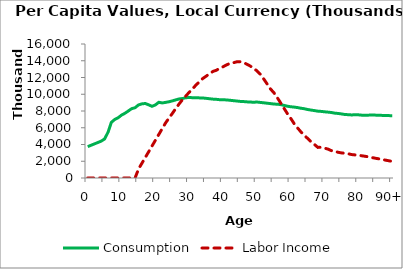
| Category | Consumption | Labor Income |
|---|---|---|
| 0 | 3745251.584 | 0 |
|  | 3909814.587 | 0 |
| 2 | 4074377.591 | 0 |
| 3 | 4237918.199 | 0 |
| 4 | 4400524.77 | 0 |
| 5 | 4662860.164 | 0 |
| 6 | 5458535.545 | 0 |
| 7 | 6646871.06 | 0 |
| 8 | 6991298.712 | 0 |
| 9 | 7197178.647 | 0 |
| 10 | 7509465.472 | 0 |
| 11 | 7729986.649 | 0 |
| 12 | 8002725.551 | 0 |
| 13 | 8279361.303 | 0 |
| 14 | 8392233.333 | 0 |
| 15 | 8719309.355 | 1059269.463 |
| 16 | 8852057.578 | 1747743.756 |
| 17 | 8897467.55 | 2436218.049 |
| 18 | 8738287.109 | 3124692.342 |
| 19 | 8560415.335 | 3813166.635 |
| 20 | 8723828.224 | 4501640.928 |
| 21 | 9040457.481 | 5190115.222 |
| 22 | 8963164.092 | 5878589.515 |
| 23 | 9029614.118 | 6567063.808 |
| 24 | 9102007.376 | 7153046.101 |
| 25 | 9207066.501 | 7705325.697 |
| 26 | 9325582.469 | 8280060.173 |
| 27 | 9438328.106 | 8840165.574 |
| 28 | 9489061.127 | 9352847.706 |
| 29 | 9588001.711 | 9796158.954 |
| 30 | 9609347.91 | 10235445.239 |
| 31 | 9591342.672 | 10656052.38 |
| 32 | 9595859.433 | 11102591.797 |
| 33 | 9565361.682 | 11480772.317 |
| 34 | 9553345.202 | 11879019.632 |
| 35 | 9512099.17 | 12157354.94 |
| 36 | 9463195.088 | 12453028.009 |
| 37 | 9418272.195 | 12724075.075 |
| 38 | 9393831.541 | 12860086.536 |
| 39 | 9349389.999 | 13099039.984 |
| 40 | 9343941.247 | 13283092.986 |
| 41 | 9322019.957 | 13503648.425 |
| 42 | 9283372.198 | 13672732.448 |
| 43 | 9236088.722 | 13751619.382 |
| 44 | 9194712.494 | 13869791.723 |
| 45 | 9148820.807 | 13884111.787 |
| 46 | 9128680.356 | 13788611.954 |
| 47 | 9092211.733 | 13595900.587 |
| 48 | 9071438.873 | 13376538.976 |
| 49 | 9044677.924 | 13096973.517 |
| 50 | 9071726.241 | 12795509.663 |
| 51 | 9023341.115 | 12389076.355 |
| 52 | 8979264.665 | 11829200.551 |
| 53 | 8929604.698 | 11236998.105 |
| 54 | 8883943.541 | 10632615.766 |
| 55 | 8829281.083 | 10191921.225 |
| 56 | 8812368.303 | 9600702.005 |
| 57 | 8764752.18 | 8974202.193 |
| 58 | 8670972.369 | 8327304.797 |
| 59 | 8569145.591 | 7687471.575 |
| 60 | 8507592.128 | 7118438.161 |
| 61 | 8464608.277 | 6487140.233 |
| 62 | 8408450.692 | 5982162.077 |
| 63 | 8327700.55 | 5504954.115 |
| 64 | 8270338.313 | 5096863.466 |
| 65 | 8175022.212 | 4714536.439 |
| 66 | 8111328.757 | 4320295.314 |
| 67 | 8046406.666 | 4001519.094 |
| 68 | 7978396.438 | 3654535.594 |
| 69 | 7950933.57 | 3669190.411 |
| 70 | 7902880.534 | 3565943.901 |
| 71 | 7865619.217 | 3448290.713 |
| 72 | 7819797.401 | 3267113.934 |
| 73 | 7743042.448 | 3183221.93 |
| 74 | 7706480.795 | 3069643.874 |
| 75 | 7647685.131 | 2995451.873 |
| 76 | 7583353.972 | 2949153.278 |
| 77 | 7559244.926 | 2889885.682 |
| 78 | 7529649.114 | 2798184.148 |
| 79 | 7556444.521 | 2754795.701 |
| 80 | 7541714.065 | 2722363.346 |
| 81 | 7502286.217 | 2652170.795 |
| 82 | 7499055.045 | 2592355.122 |
| 83 | 7506513.706 | 2515572.408 |
| 84 | 7513805.375 | 2438789.695 |
| 85 | 7507822.024 | 2362006.982 |
| 86 | 7484504.401 | 2285224.269 |
| 87 | 7476625.942 | 2208441.556 |
| 88 | 7465961.292 | 2131658.842 |
| 89 | 7449991.869 | 2054876.129 |
| 90+ | 7433251.734 | 1978093.416 |